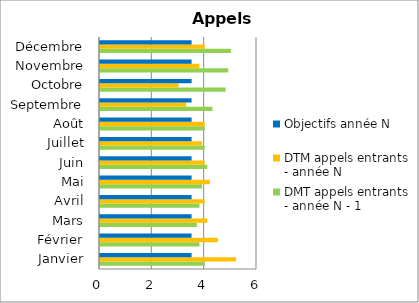
| Category | DMT appels entrants  - année N - 1 | DTM appels entrants - année N | Objectifs année N |
|---|---|---|---|
| Janvier | 4 | 5.2 | 3.5 |
| Février | 3.8 | 4.5 | 3.5 |
| Mars | 3.7 | 4.1 | 3.5 |
| Avril | 3.8 | 4 | 3.5 |
| Mai | 3.9 | 4.2 | 3.5 |
| Juin | 4.1 | 4 | 3.5 |
| Juillet | 4 | 3.9 | 3.5 |
| Août | 4 | 4 | 3.5 |
| Septembre | 4.3 | 3.3 | 3.5 |
| Octobre | 4.8 | 3 | 3.5 |
| Novembre | 4.9 | 3.8 | 3.5 |
| Décembre | 5 | 4 | 3.5 |